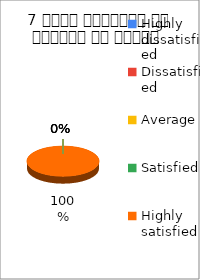
| Category | 7 विषय अवधारणा पर शिक्षक का ज्ञान  |
|---|---|
| Highly dissatisfied | 0 |
| Dissatisfied | 0 |
| Average | 0 |
| Satisfied | 0 |
| Highly satisfied | 2 |